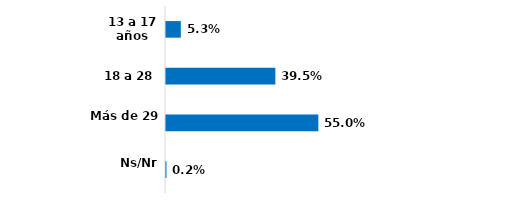
| Category | Series 0 |
|---|---|
| 13 a 17 años | 0.053 |
| 18 a 28  | 0.395 |
| Más de 29 | 0.55 |
| Ns/Nr | 0.002 |